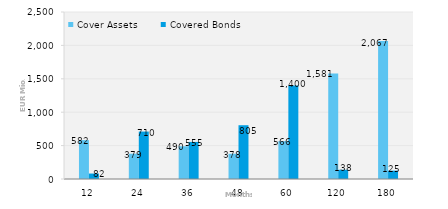
| Category | Cover Assets | Covered Bonds |
|---|---|---|
| 12.0 | 581.912 | 81.656 |
| 24.0 | 378.805 | 710 |
| 36.0 | 490.176 | 555 |
| 48.0 | 377.83 | 805 |
| 60.0 | 566.033 | 1400 |
| 120.0 | 1581.039 | 138 |
| 180.0 | 2066.532 | 125 |